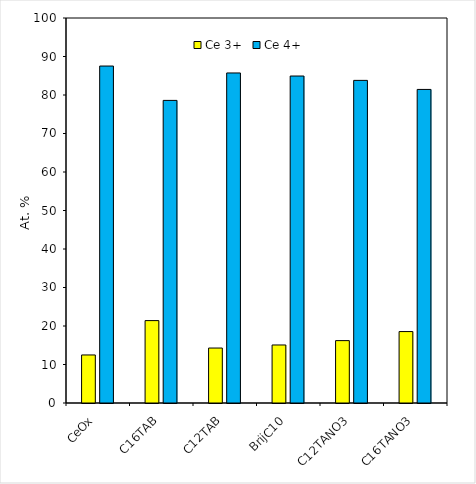
| Category | Ce 3+ | Ce 4+ |
|---|---|---|
| CeOx | 12.479 | 87.521 |
| C16TAB | 21.402 | 78.598 |
| C12TAB | 14.276 | 85.724 |
| BrijC10 | 15.069 | 84.931 |
| C12TANO3 | 16.202 | 83.798 |
| C16TANO3 | 18.555 | 81.445 |